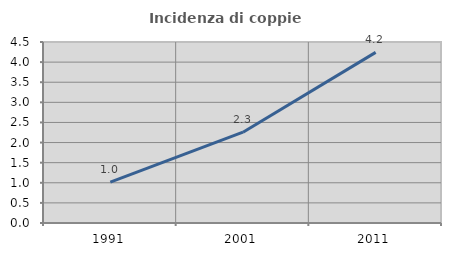
| Category | Incidenza di coppie miste |
|---|---|
| 1991.0 | 1.017 |
| 2001.0 | 2.258 |
| 2011.0 | 4.242 |